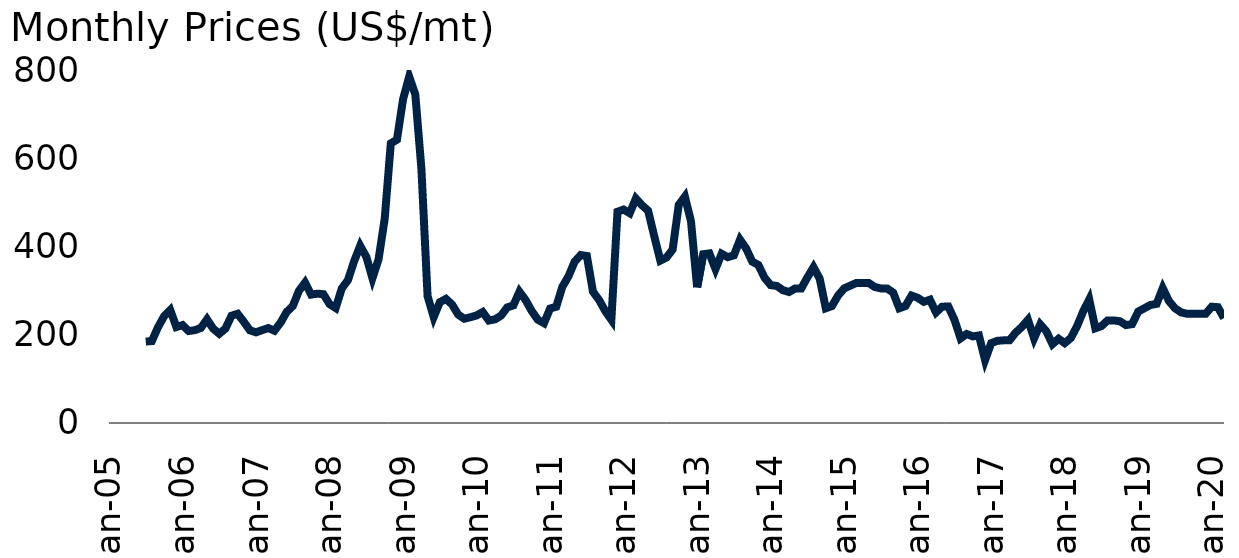
| Category | Nitrogen |
|---|---|
| 2005-07-01 | 184.6 |
| 2005-08-01 | 185.75 |
| 2005-09-01 | 217.125 |
| 2005-10-01 | 242.125 |
| 2005-11-01 | 256 |
| 2005-12-01 | 217.5 |
| 2006-01-01 | 221.875 |
| 2006-02-01 | 208.5 |
| 2006-03-01 | 210.375 |
| 2006-04-01 | 215.5 |
| 2006-05-01 | 235 |
| 2006-06-01 | 213.875 |
| 2006-07-01 | 202.3 |
| 2006-08-01 | 213.875 |
| 2006-09-01 | 243.125 |
| 2006-10-01 | 247.5 |
| 2006-11-01 | 229.5 |
| 2006-12-01 | 210 |
| 2007-01-01 | 205.5 |
| 2007-02-01 | 210.5 |
| 2007-03-01 | 215.125 |
| 2007-04-01 | 209.2 |
| 2007-05-01 | 227.375 |
| 2007-06-01 | 251.667 |
| 2007-07-01 | 265 |
| 2007-08-01 | 299.375 |
| 2007-09-01 | 318.125 |
| 2007-10-01 | 291 |
| 2007-11-01 | 293.125 |
| 2007-12-01 | 291.875 |
| 2008-01-01 | 269.5 |
| 2008-02-01 | 260.625 |
| 2008-03-01 | 305 |
| 2008-04-01 | 323.75 |
| 2008-05-01 | 366.25 |
| 2008-06-01 | 401.667 |
| 2008-07-01 | 376.625 |
| 2008-08-01 | 328.125 |
| 2008-09-01 | 371 |
| 2008-10-01 | 462.5 |
| 2008-11-01 | 633.75 |
| 2008-12-01 | 642 |
| 2009-01-01 | 733.75 |
| 2009-02-01 | 785 |
| 2009-03-01 | 744.5 |
| 2009-04-01 | 575 |
| 2009-05-01 | 287.5 |
| 2009-06-01 | 240 |
| 2009-07-01 | 273.75 |
| 2009-08-01 | 281.25 |
| 2009-09-01 | 268.5 |
| 2009-10-01 | 245.625 |
| 2009-11-01 | 236.25 |
| 2009-12-01 | 239.7 |
| 2010-01-01 | 243.75 |
| 2010-02-01 | 251.5 |
| 2010-03-01 | 232.25 |
| 2010-04-01 | 234.875 |
| 2010-05-01 | 243.5 |
| 2010-06-01 | 262 |
| 2010-07-01 | 266.5 |
| 2010-08-01 | 297.5 |
| 2010-09-01 | 278.7 |
| 2010-10-01 | 253.75 |
| 2010-11-01 | 234 |
| 2010-12-01 | 226.25 |
| 2011-01-01 | 259.375 |
| 2011-02-01 | 263.5 |
| 2011-03-01 | 308.75 |
| 2011-04-01 | 332.5 |
| 2011-05-01 | 365.4 |
| 2011-06-01 | 380.625 |
| 2011-07-01 | 378.5 |
| 2011-08-01 | 297.5 |
| 2011-09-01 | 278.7 |
| 2011-10-01 | 253.75 |
| 2011-11-01 | 234 |
| 2011-12-01 | 478.75 |
| 2012-01-01 | 483.75 |
| 2012-02-01 | 475.5 |
| 2012-03-01 | 508.75 |
| 2012-04-01 | 493.5 |
| 2012-05-01 | 481.25 |
| 2012-06-01 | 423.125 |
| 2012-07-01 | 368 |
| 2012-08-01 | 375 |
| 2012-09-01 | 393.125 |
| 2012-10-01 | 494.375 |
| 2012-11-01 | 513.125 |
| 2012-12-01 | 456.875 |
| 2013-01-01 | 307.5 |
| 2013-02-01 | 382.5 |
| 2013-03-01 | 384.375 |
| 2013-04-01 | 349 |
| 2013-05-01 | 383.5 |
| 2013-06-01 | 375.833 |
| 2013-07-01 | 380 |
| 2013-08-01 | 415.625 |
| 2013-09-01 | 395.625 |
| 2013-10-01 | 365.625 |
| 2013-11-01 | 358.125 |
| 2013-12-01 | 329.375 |
| 2014-01-01 | 312.5 |
| 2014-02-01 | 310.625 |
| 2014-03-01 | 301 |
| 2014-04-01 | 296.875 |
| 2014-05-01 | 305 |
| 2014-06-01 | 305 |
| 2014-07-01 | 330 |
| 2014-08-01 | 353.125 |
| 2014-09-01 | 327.5 |
| 2014-10-01 | 260 |
| 2014-11-01 | 265 |
| 2014-12-01 | 288.75 |
| 2015-01-01 | 305 |
| 2015-02-01 | 311.25 |
| 2015-03-01 | 317.5 |
| 2015-04-01 | 317.5 |
| 2015-05-01 | 317.5 |
| 2015-06-01 | 308.125 |
| 2015-07-01 | 305 |
| 2015-08-01 | 305 |
| 2015-09-01 | 295.5 |
| 2015-10-01 | 260 |
| 2015-11-01 | 265 |
| 2015-12-01 | 288.75 |
| 2016-01-01 | 283.75 |
| 2016-02-01 | 274.625 |
| 2016-03-01 | 279.375 |
| 2016-04-01 | 250.625 |
| 2016-05-01 | 263.625 |
| 2016-06-01 | 264 |
| 2016-07-01 | 233.875 |
| 2016-08-01 | 191.875 |
| 2016-09-01 | 201.75 |
| 2016-10-01 | 196.25 |
| 2016-11-01 | 198.375 |
| 2016-12-01 | 142.625 |
| 2017-01-01 | 181 |
| 2017-02-01 | 186.25 |
| 2017-03-01 | 187.3 |
| 2017-04-01 | 187.5 |
| 2017-05-01 | 205 |
| 2017-06-01 | 217.75 |
| 2017-07-01 | 233.75 |
| 2017-08-01 | 191.875 |
| 2017-09-01 | 223.5 |
| 2017-10-01 | 207.875 |
| 2017-11-01 | 178.75 |
| 2017-12-01 | 191 |
| 2018-01-01 | 181 |
| 2018-02-01 | 192.625 |
| 2018-03-01 | 219 |
| 2018-04-01 | 252.5 |
| 2018-05-01 | 280 |
| 2018-06-01 | 214.625 |
| 2018-07-01 | 219.625 |
| 2018-08-01 | 232.5 |
| 2018-09-01 | 232.5 |
| 2018-10-01 | 230.625 |
| 2018-11-01 | 221.875 |
| 2018-12-01 | 224 |
| 2019-01-01 | 252.5 |
| 2019-02-01 | 260 |
| 2019-03-01 | 267.5 |
| 2019-04-01 | 270 |
| 2019-05-01 | 305.6 |
| 2019-06-01 | 276.67 |
| 2019-07-01 | 260 |
| 2019-08-01 | 250.63 |
| 2019-09-01 | 247.5 |
| 2019-10-01 | 247.5 |
| 2019-11-01 | 247.5 |
| 2019-12-01 | 247.5 |
| 2020-01-01 | 263.5 |
| 2020-02-01 | 262.5 |
| 2020-03-01 | 237.75 |